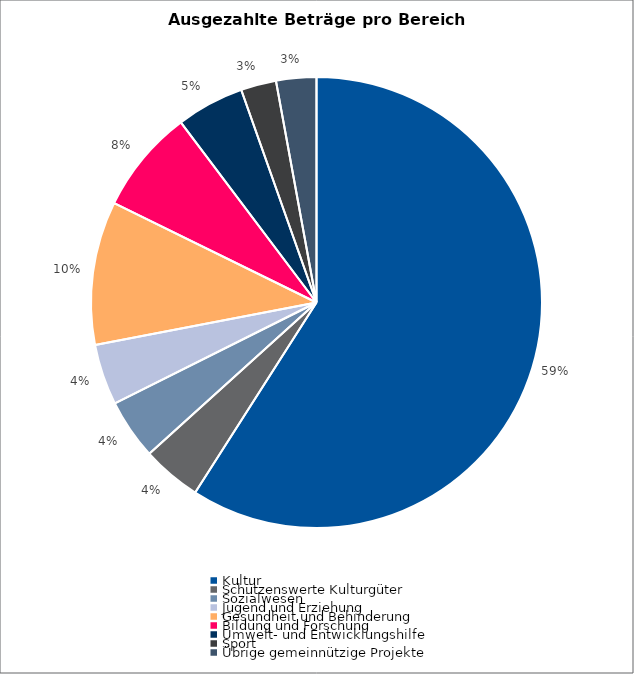
| Category | Series 0 |
|---|---|
| Kultur | 2766562.29 |
| Schützenswerte Kulturgüter | 199672 |
| Sozialwesen | 202175 |
| Jugend und Erziehung | 204565 |
| Gesundheit und Behinderung | 481979 |
| Bildung und Forschung | 349452 |
| Umwelt- und Entwicklungshilfe | 227650 |
| Sport | 118750 |
| Übrige gemeinnützige Projekte | 135000 |